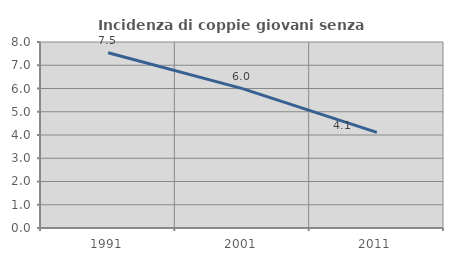
| Category | Incidenza di coppie giovani senza figli |
|---|---|
| 1991.0 | 7.535 |
| 2001.0 | 5.996 |
| 2011.0 | 4.116 |